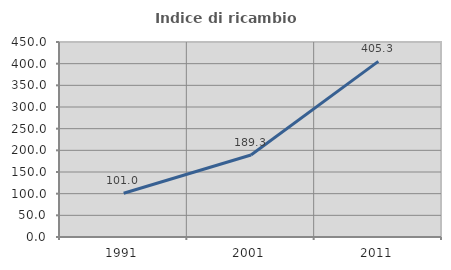
| Category | Indice di ricambio occupazionale  |
|---|---|
| 1991.0 | 100.957 |
| 2001.0 | 189.333 |
| 2011.0 | 405.319 |